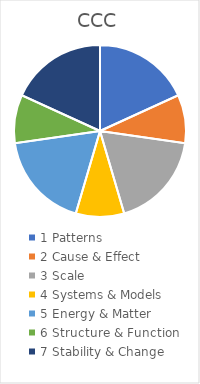
| Category | CCC |
|---|---|
| 1 Patterns | 0.182 |
| 2 Cause & Effect | 0.091 |
| 3 Scale | 0.182 |
| 4 Systems & Models | 0.091 |
| 5 Energy & Matter | 0.182 |
| 6 Structure & Function | 0.091 |
| 7 Stability & Change | 0.182 |